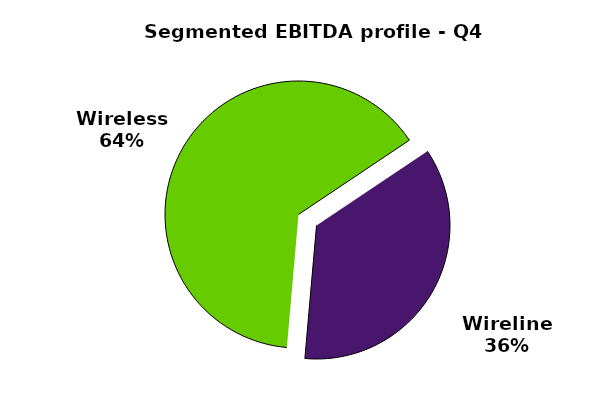
| Category | Series 0 |
|---|---|
| Wireless | 0.642 |
| Wireline | 0.358 |